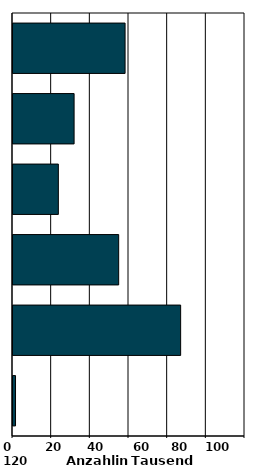
| Category | Series 0 |
|---|---|
| 0 | 1.307 |
| 1 | 86.718 |
| 2 | 54.664 |
| 3 | 23.461 |
| 4 | 31.604 |
| 5 | 57.972 |